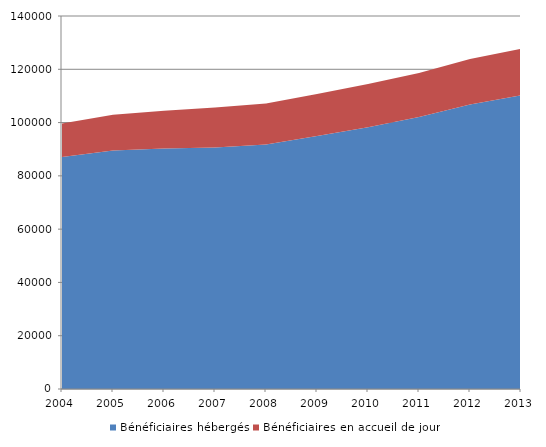
| Category | Bénéficiaires hébergés | Bénéficiaires en accueil de jour |
|---|---|---|
| 2004.0 | 87074.299 | 12603.656 |
| 2005.0 | 89515.331 | 13445.003 |
| 2006.0 | 90249.523 | 14229.207 |
| 2007.0 | 90627.835 | 15003.342 |
| 2008.0 | 91789.705 | 15334.937 |
| 2009.0 | 94923.753 | 15844.568 |
| 2010.0 | 98212.653 | 16270.422 |
| 2011.0 | 102051.925 | 16571.181 |
| 2012.0 | 106756.691 | 17117.454 |
| 2013.0 | 110257.64 | 17465.942 |